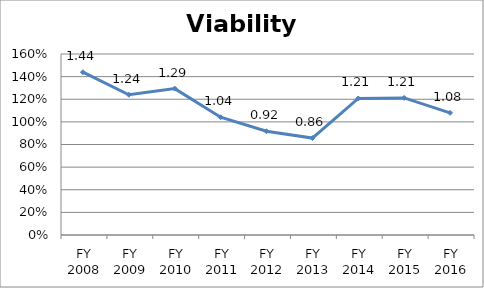
| Category | Viability ratio |
|---|---|
| FY 2016 | 1.08 |
| FY 2015 | 1.212 |
| FY 2014 | 1.207 |
| FY 2013 | 0.857 |
| FY 2012 | 0.917 |
| FY 2011 | 1.041 |
| FY 2010 | 1.294 |
| FY 2009 | 1.24 |
| FY 2008 | 1.439 |